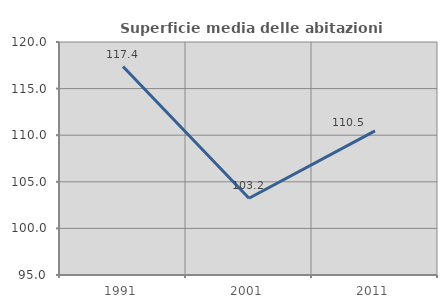
| Category | Superficie media delle abitazioni occupate |
|---|---|
| 1991.0 | 117.37 |
| 2001.0 | 103.235 |
| 2011.0 | 110.463 |